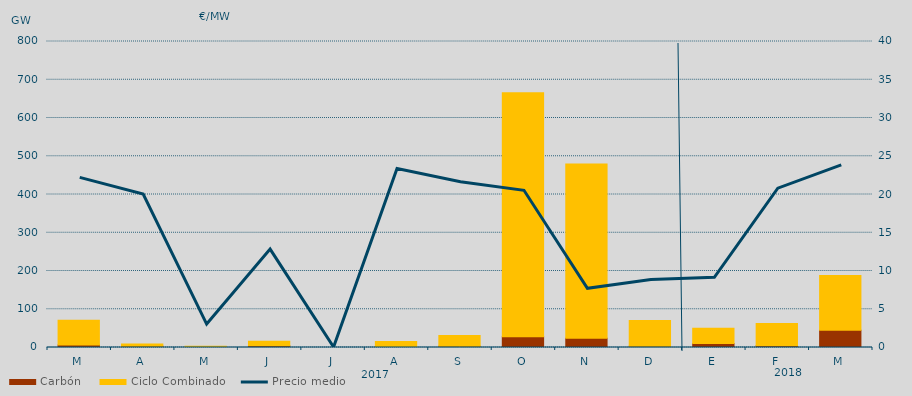
| Category | Carbón | Ciclo Combinado |
|---|---|---|
| M | 6612.9 | 64802.4 |
| A | 3055 | 6101.5 |
| M | 341 | 2659 |
| J | 4305 | 11713 |
| J | 0 | 0 |
| A | 0 | 15430.5 |
| S | 3306.6 | 27967.5 |
| O | 27914.4 | 638167.2 |
| N | 23926.9 | 455734.5 |
| D | 3200.6 | 67420.5 |
| E | 10696.2 | 39454.7 |
| F | 4341.9 | 58215.4 |
| M | 45246.3 | 142680.5 |